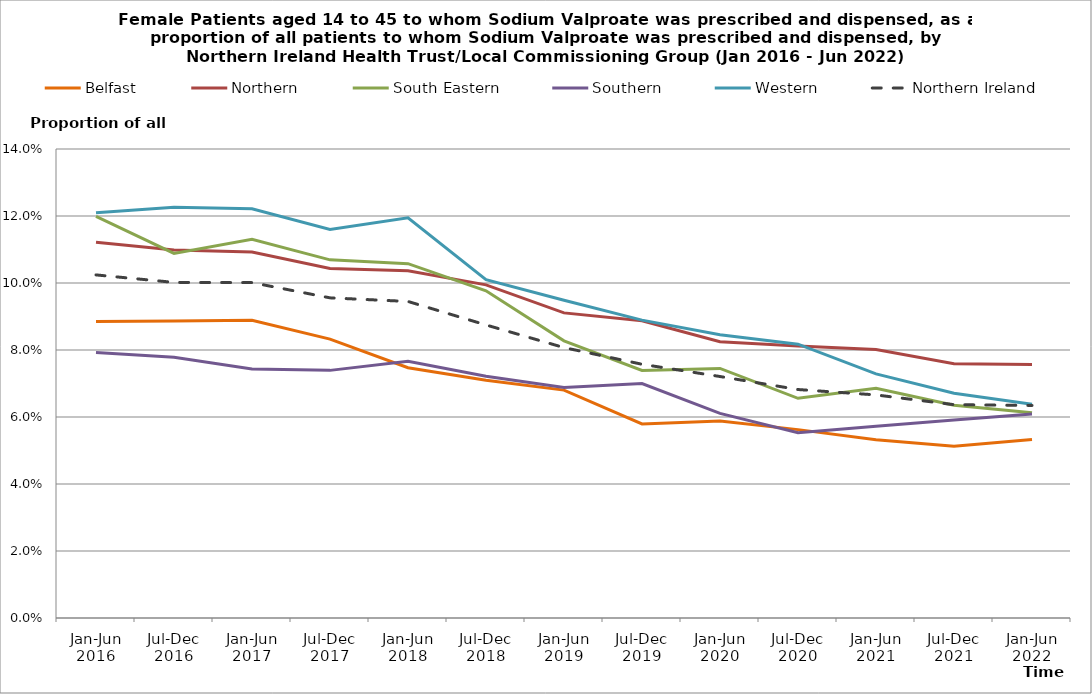
| Category | Belfast | Northern | South Eastern | Southern | Western | Northern Ireland |
|---|---|---|---|---|---|---|
| Jan-Jun 2016 | 0.089 | 0.112 | 0.12 | 0.079 | 0.121 | 0.102 |
| Jul-Dec 2016 | 0.089 | 0.11 | 0.109 | 0.078 | 0.123 | 0.1 |
| Jan-Jun 2017 | 0.089 | 0.109 | 0.113 | 0.074 | 0.122 | 0.1 |
| Jul-Dec 2017 | 0.083 | 0.104 | 0.107 | 0.074 | 0.116 | 0.096 |
| Jan-Jun 2018 | 0.075 | 0.104 | 0.106 | 0.077 | 0.119 | 0.094 |
| Jul-Dec 2018 | 0.071 | 0.099 | 0.098 | 0.072 | 0.101 | 0.087 |
| Jan-Jun 2019 | 0.068 | 0.091 | 0.083 | 0.069 | 0.095 | 0.081 |
| Jul-Dec 2019 | 0.058 | 0.089 | 0.074 | 0.07 | 0.089 | 0.076 |
| Jan-Jun 2020 | 0.059 | 0.082 | 0.075 | 0.061 | 0.085 | 0.072 |
| Jul-Dec 2020 | 0.056 | 0.081 | 0.066 | 0.055 | 0.082 | 0.068 |
| Jan-Jun 2021 | 0.053 | 0.08 | 0.069 | 0.057 | 0.073 | 0.067 |
| Jul-Dec 2021 | 0.051 | 0.076 | 0.064 | 0.059 | 0.067 | 0.064 |
| Jan-Jun 2022 | 0.053 | 0.076 | 0.061 | 0.061 | 0.064 | 0.063 |